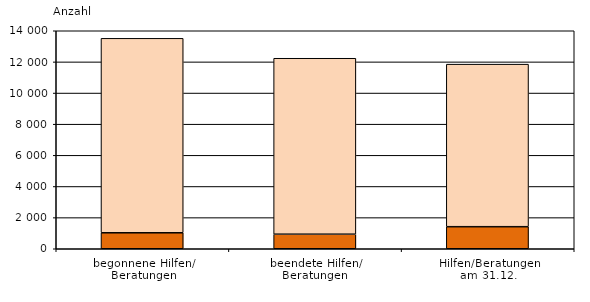
| Category | Series 0 | Series 1 |
|---|---|---|
| begonnene Hilfen/
Beratungen | 1026 | 12489 |
| beendete Hilfen/
Beratungen  | 935 | 11299 |
| Hilfen/Beratungen
am 31.12. | 1416 | 10439 |